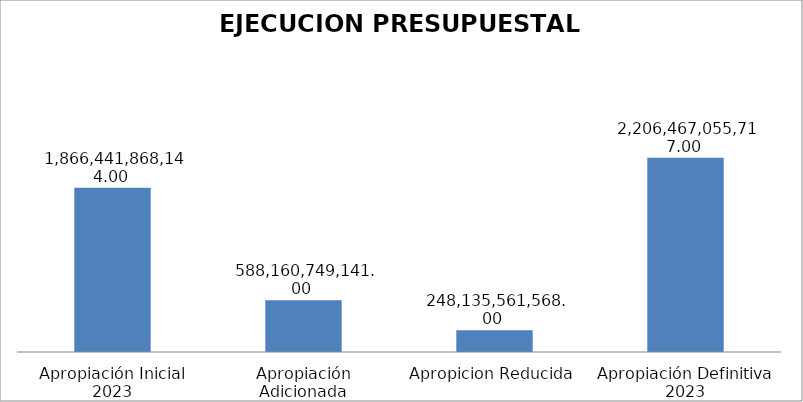
| Category | Series 0 |
|---|---|
| Apropiación Inicial 2023 | 1866441868144 |
| Apropiación Adicionada | 588160749141 |
| Apropicion Reducida | 248135561568 |
| Apropiación Definitiva 2023 | 2206467055717 |